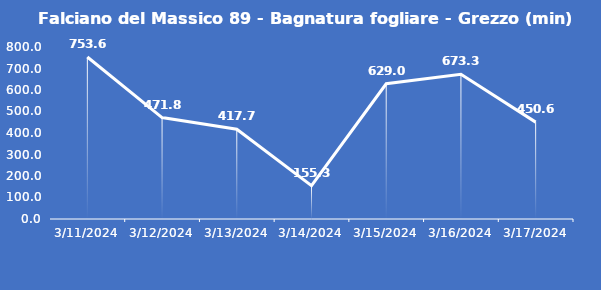
| Category | Falciano del Massico 89 - Bagnatura fogliare - Grezzo (min) |
|---|---|
| 3/11/24 | 753.6 |
| 3/12/24 | 471.8 |
| 3/13/24 | 417.7 |
| 3/14/24 | 155.3 |
| 3/15/24 | 629 |
| 3/16/24 | 673.3 |
| 3/17/24 | 450.6 |